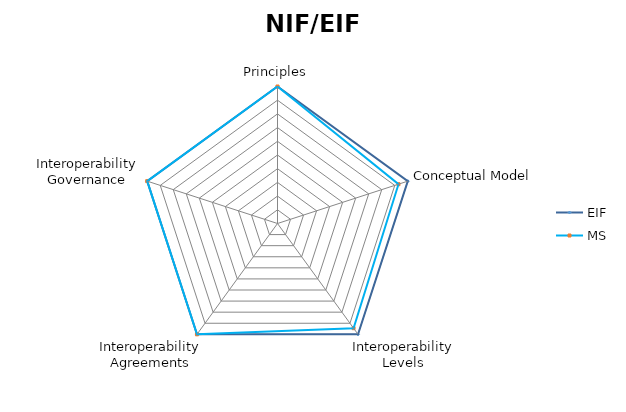
| Category | EIF | MS |
|---|---|---|
| Principles | 1 | 1 |
| Conceptual Model | 1 | 0.929 |
| Interoperability Levels | 1 | 0.944 |
| Interoperability Agreements | 1 | 1 |
| Interoperability Governance | 1 | 1 |